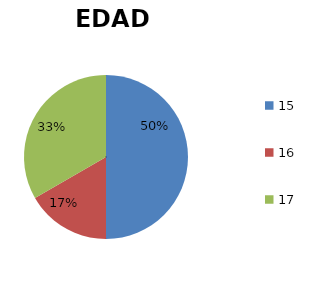
| Category | EDAD |
|---|---|
| 15.0 | 3 |
| 16.0 | 1 |
| 17.0 | 2 |